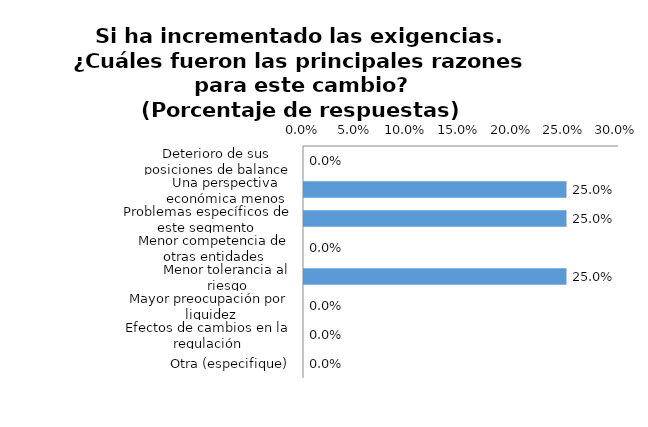
| Category | Series 0 |
|---|---|
| Deterioro de sus posiciones de balance | 0 |
| Una perspectiva económica menos favorable o incierta | 0.25 |
| Problemas específicos de este segmento | 0.25 |
| Menor competencia de otras entidades | 0 |
| Menor tolerancia al riesgo | 0.25 |
| Mayor preocupación por liquidez | 0 |
| Efectos de cambios en la regulación | 0 |
| Otra (especifique) | 0 |